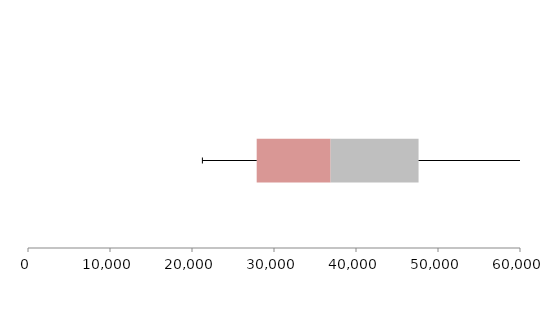
| Category | Series 1 | Series 2 | Series 3 |
|---|---|---|---|
| 0 | 27889.575 | 9014.812 | 10725.86 |